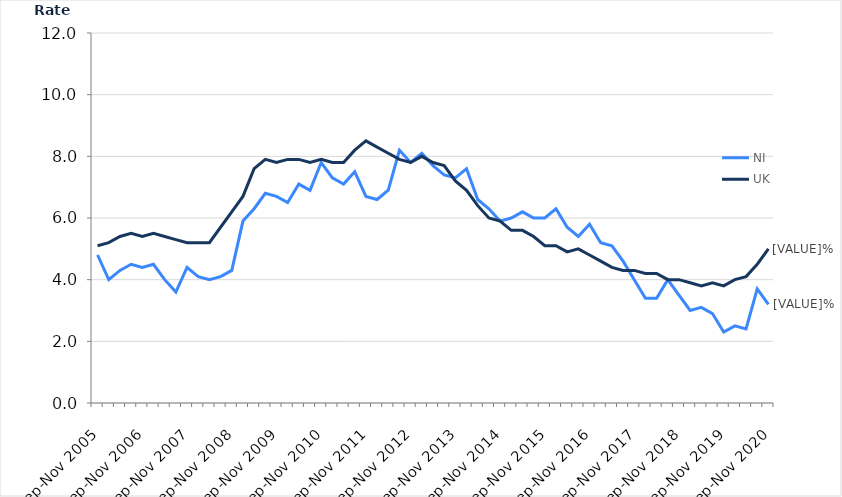
| Category | NI | UK |
|---|---|---|
| Sep-Nov 2005 | 4.8 | 5.1 |
| Dec-Feb 2006 | 4 | 5.2 |
| Mar-May 2006 | 4.3 | 5.4 |
| Jun-Aug 2006 | 4.5 | 5.5 |
| Sep-Nov 2006 | 4.4 | 5.4 |
| Dec-Feb 2007 | 4.5 | 5.5 |
| Mar-May 2007 | 4 | 5.4 |
| Jun-Aug 2007 | 3.6 | 5.3 |
| Sep-Nov 2007 | 4.4 | 5.2 |
| Dec-Feb 2008 | 4.1 | 5.2 |
| Mar-May 2008 | 4 | 5.2 |
| Jun-Aug 2008 | 4.1 | 5.7 |
| Sep-Nov 2008 | 4.3 | 6.2 |
| Dec-Feb 2009 | 5.9 | 6.7 |
| Mar-May 2009 | 6.3 | 7.6 |
| Jun-Aug 2009 | 6.8 | 7.9 |
| Sep-Nov 2009 | 6.7 | 7.8 |
| Dec-Feb 2010 | 6.5 | 7.9 |
| Mar-May 2010 | 7.1 | 7.9 |
| Jun-Aug 2010 | 6.9 | 7.8 |
| Sep-Nov 2010 | 7.8 | 7.9 |
| Dec-Feb 2011 | 7.3 | 7.8 |
| Mar-May 2011 | 7.1 | 7.8 |
| Jun-Aug 2011 | 7.5 | 8.2 |
| Sep-Nov 2011 | 6.7 | 8.5 |
| Dec-Feb 2012 | 6.6 | 8.3 |
| Mar-May 2012 | 6.9 | 8.1 |
| Jun-Aug 2012 | 8.2 | 7.9 |
| Sep-Nov 2012 | 7.8 | 7.8 |
| Dec-Feb 2013 | 8.1 | 8 |
| Mar-May 2013 | 7.7 | 7.8 |
| Jun-Aug 2013 | 7.4 | 7.7 |
| Sep-Nov 2013 | 7.3 | 7.2 |
| Dec-Feb 2014 | 7.6 | 6.9 |
| Mar-May 2014 | 6.6 | 6.4 |
| Jun-Aug 2014 | 6.3 | 6 |
| Sep-Nov 2014 | 5.9 | 5.9 |
| Dec-Feb 2015 | 6 | 5.6 |
| Mar-May 2015 | 6.2 | 5.6 |
| Jun-Aug 2015 | 6 | 5.4 |
| Sep-Nov 2015 | 6 | 5.1 |
| Dec-Feb 2016 | 6.3 | 5.1 |
| Mar-May 2016 | 5.7 | 4.9 |
| Jun-Aug 2016 | 5.4 | 5 |
| Sep-Nov 2016 | 5.8 | 4.8 |
| Dec-Feb 2017 | 5.2 | 4.6 |
| Mar-May 2017 | 5.1 | 4.4 |
| Jun-Aug 2017 | 4.6 | 4.3 |
| Sep-Nov 2017 | 4 | 4.3 |
| Dec-Feb 2018 | 3.4 | 4.2 |
| Mar-May 2018 | 3.4 | 4.2 |
| Jun-Aug 2018 | 4 | 4 |
| Sep-Nov 2018 | 3.5 | 4 |
| Dec-Feb 2019 | 3 | 3.9 |
| Mar-May 2019 | 3.1 | 3.8 |
| Jun-Aug 2019 | 2.9 | 3.9 |
| Sep-Nov 2019 | 2.3 | 3.8 |
| Dec-Feb 2020 | 2.5 | 4 |
| Mar-May 2020 | 2.4 | 4.1 |
| Jun-Aug 2020 | 3.7 | 4.5 |
| Sep-Nov 2020 | 3.2 | 5 |